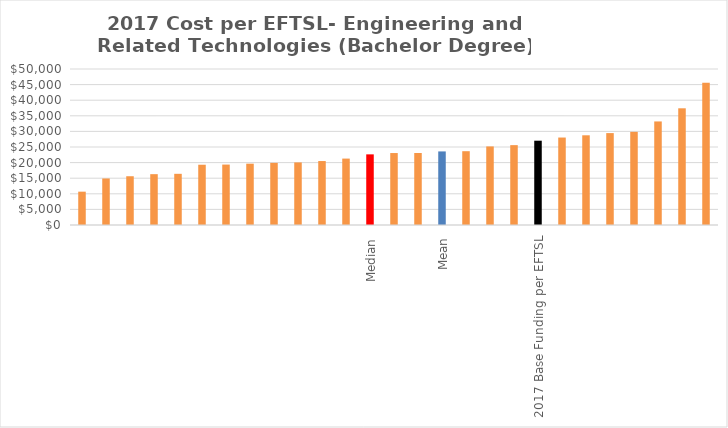
| Category | Series 0 |
|---|---|
|  | 10684.218 |
|  | 14913.253 |
|  | 15630.524 |
|  | 16294.739 |
|  | 16405.315 |
|  | 19316.764 |
|  | 19367.367 |
|  | 19656.324 |
|  | 19910.582 |
|  | 20060.257 |
|  | 20499.036 |
|  | 21285.945 |
| Median | 22640.429 |
|  | 23065.434 |
|  | 23075.049 |
| Mean | 23583 |
|  | 23654.698 |
|  | 25184.984 |
|  | 25597.235 |
| 2017 Base Funding per EFTSL | 27021 |